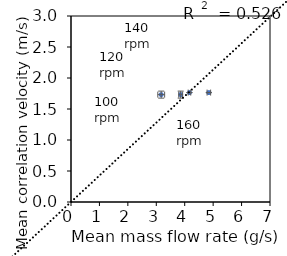
| Category | Series 0 |
|---|---|
| 3.1734999999999993 | 1.732 |
| 3.8581333333333334 | 1.732 |
| 4.166566666666667 | 1.765 |
| 4.848633333333333 | 1.765 |